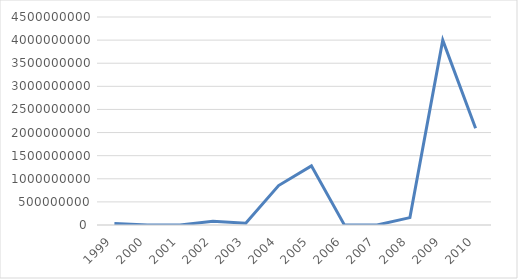
| Category | Series 0 |
|---|---|
| 1999.0 | 33600000 |
| 2000.0 | 0 |
| 2001.0 | 0 |
| 2002.0 | 82714200 |
| 2003.0 | 36897600 |
| 2004.0 | 853366697 |
| 2005.0 | 1279899987 |
| 2006.0 | 7500000 |
| 2007.0 | 0 |
| 2008.0 | 159625470 |
| 2009.0 | 3999858878 |
| 2010.0 | 2093122152 |